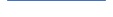
| Category | Series 0 |
|---|---|
| 0 | 1 |
| 1 | 2 |
| 2 | 0 |
| 3 | 0 |
| 4 | 0 |
| 5 | 0 |
| 6 | 1 |
| 7 | 0 |
| 8 | 3 |